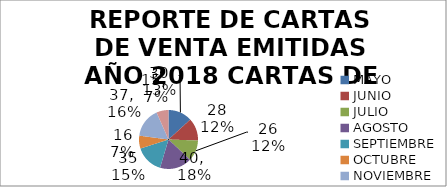
| Category | REPORTE DE CARTAS DE VENTA EMITIDAS AÑO 2018 CARTAS DE VENTAS EMITIDAS |
|---|---|
| MAYO | 30 |
| JUNIO | 28 |
| JULIO | 26 |
| AGOSTO | 40 |
| SEPTIEMBRE | 35 |
| OCTUBRE | 16 |
| NOVIEMBRE | 37 |
| DICIEMBRE | 15 |